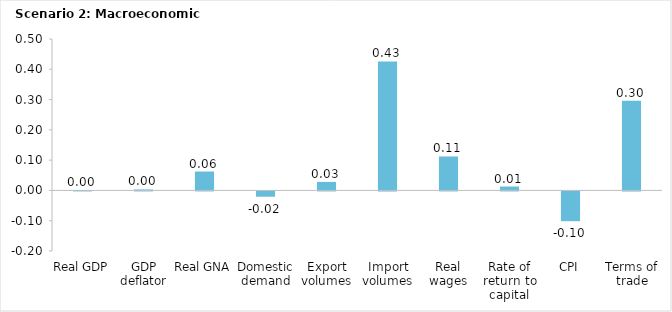
| Category | Series 0 |
|---|---|
| Real GDP | 0 |
| GDP deflator | 0.003 |
| Real GNA | 0.062 |
| Domestic demand | -0.017 |
| Export volumes | 0.028 |
| Import volumes | 0.426 |
| Real wages | 0.112 |
| Rate of return to capital | 0.013 |
| CPI | -0.098 |
| Terms of trade | 0.296 |